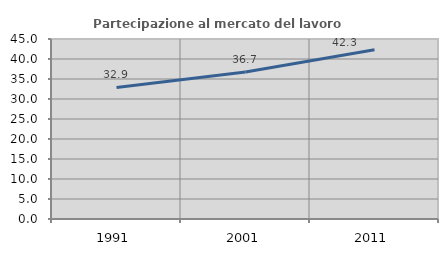
| Category | Partecipazione al mercato del lavoro  femminile |
|---|---|
| 1991.0 | 32.902 |
| 2001.0 | 36.748 |
| 2011.0 | 42.293 |